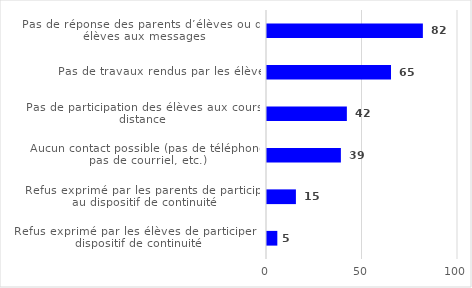
| Category | Series 0 |
|---|---|
| Pas de réponse des parents d’élèves ou des élèves aux messages | 81.607 |
| Pas de travaux rendus par les élèves | 64.927 |
| Pas de participation des élèves aux cours à distance | 41.815 |
| Aucun contact possible (pas de téléphone, pas de courriel, etc.) | 38.681 |
| Refus exprimé par les parents de participer au dispositif de continuité | 15.134 |
| Refus exprimé par les élèves de participer au dispositif de continuité | 5.407 |